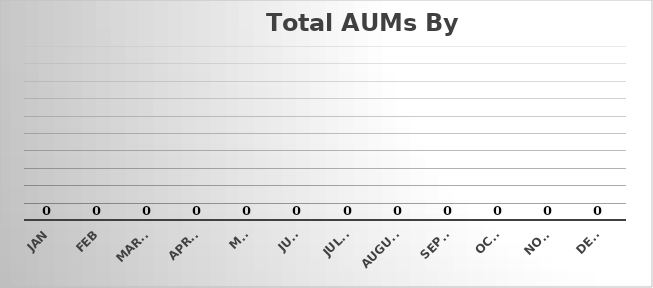
| Category | Series 0 |
|---|---|
| Jan | 0 |
| Feb | 0 |
| March | 0 |
| April | 0 |
| May | 0 |
| June | 0 |
| July  | 0 |
| August | 0 |
| Sept. | 0 |
| Oct. | 0 |
| Nov. | 0 |
| Dec. | 0 |